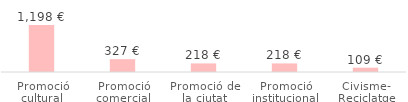
| Category | Total |
|---|---|
| Promoció cultural | 1197.9 |
| Promoció comercial | 326.7 |
| Promoció de la ciutat | 217.8 |
| Promoció institucional | 217.8 |
| Civisme- Reciclatge | 108.9 |